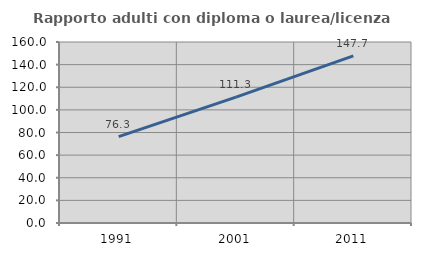
| Category | Rapporto adulti con diploma o laurea/licenza media  |
|---|---|
| 1991.0 | 76.294 |
| 2001.0 | 111.331 |
| 2011.0 | 147.747 |